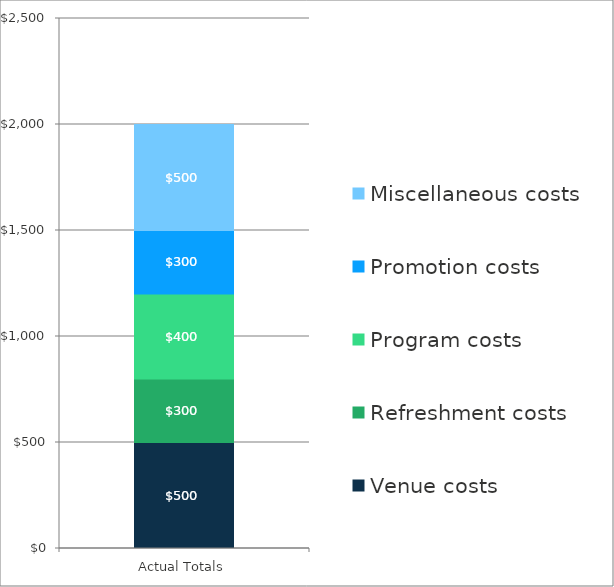
| Category | Venue costs | Refreshment costs | Program costs | Promotion costs | Miscellaneous costs |
|---|---|---|---|---|---|
| Actual Totals | 500 | 300 | 400 | 300 | 500 |